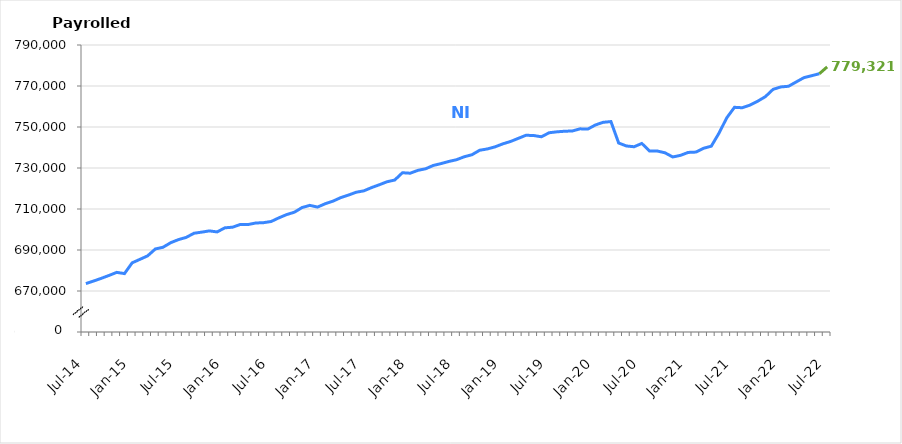
| Category | NI |
|---|---|
| Jul-14 | 673624 |
| Aug-14 | 674861 |
| Sep-14 | 676182 |
| Oct-14 | 677591 |
| Nov-14 | 679094 |
| Dec-14 | 678491 |
| Jan-15 | 683752 |
| Feb-15 | 685436 |
| Mar-15 | 687143 |
| Apr-15 | 690508 |
| May-15 | 691346 |
| Jun-15 | 693587 |
| Jul-15 | 695077 |
| Aug-15 | 696149 |
| Sep-15 | 698171 |
| Oct-15 | 698717 |
| Nov-15 | 699320 |
| Dec-15 | 698815 |
| Jan-16 | 700816 |
| Feb-16 | 701122 |
| Mar-16 | 702457 |
| Apr-16 | 702424 |
| May-16 | 703173 |
| Jun-16 | 703324 |
| Jul-16 | 703909 |
| Aug-16 | 705689 |
| Sep-16 | 707268 |
| Oct-16 | 708430 |
| Nov-16 | 710706 |
| Dec-16 | 711771 |
| Jan-17 | 710939 |
| Feb-17 | 712564 |
| Mar-17 | 713823 |
| Apr-17 | 715539 |
| May-17 | 716771 |
| Jun-17 | 718171 |
| Jul-17 | 718851 |
| Aug-17 | 720448 |
| Sep-17 | 721817 |
| Oct-17 | 723283 |
| Nov-17 | 724133 |
| Dec-17 | 727691 |
| Jan-18 | 727455 |
| Feb-18 | 728850 |
| Mar-18 | 729620 |
| Apr-18 | 731248 |
| May-18 | 732152 |
| Jun-18 | 733187 |
| Jul-18 | 734037 |
| Aug-18 | 735478 |
| Sep-18 | 736471 |
| Oct-18 | 738658 |
| Nov-18 | 739303 |
| Dec-18 | 740324 |
| Jan-19 | 741781 |
| Feb-19 | 742934 |
| Mar-19 | 744451 |
| Apr-19 | 745974 |
| May-19 | 745834 |
| Jun-19 | 745236 |
| Jul-19 | 747199 |
| Aug-19 | 747643 |
| Sep-19 | 747929 |
| Oct-19 | 748060 |
| Nov-19 | 749103 |
| Dec-19 | 748985 |
| Jan-20 | 751006 |
| Feb-20 | 752291 |
| Mar-20 | 752645 |
| Apr-20 | 742199 |
| May-20 | 740741 |
| Jun-20 | 740368 |
| Jul-20 | 741975 |
| Aug-20 | 738264 |
| Sep-20 | 738282 |
| Oct-20 | 737422 |
| Nov-20 | 735377 |
| Dec-20 | 736159 |
| Jan-21 | 737594 |
| Feb-21 | 737768 |
| Mar-21 | 739622 |
| Apr-21 | 740653 |
| May-21 | 747031 |
| Jun-21 | 754474 |
| Jul-21 | 759604 |
| Aug-21 | 759394 |
| Sep-21 | 760676 |
| Oct-21 | 762571 |
| Nov-21 | 764800 |
| Dec-21 | 768369 |
| Jan-22 | 769543 |
| Feb-22 | 769871 |
| Mar-22 | 771992 |
| Apr-22 | 774081 |
| May-22 | 775027 |
| Jun-22 | 775999 |
| Jul-22 | 779321 |